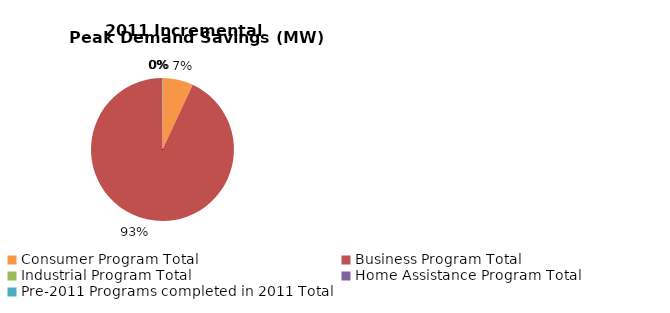
| Category | Incremental Peak Demand Savings (kW) |
|---|---|
| Consumer Program Total | 3.074 |
| Business Program Total | 41.142 |
| Industrial Program Total | 0 |
| Home Assistance Program Total | 0 |
| Pre-2011 Programs completed in 2011 Total | 0.045 |